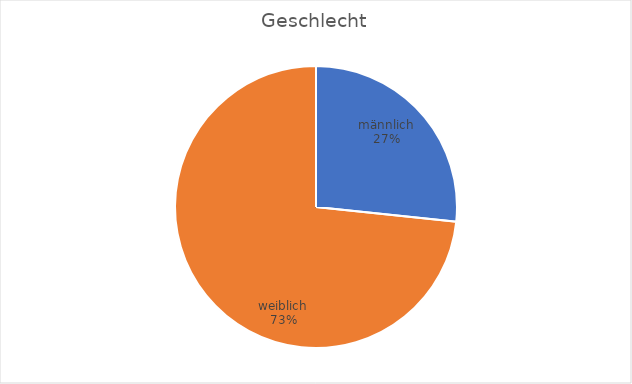
| Category | Series 0 |
|---|---|
| männlich | 8 |
| weiblich | 22 |